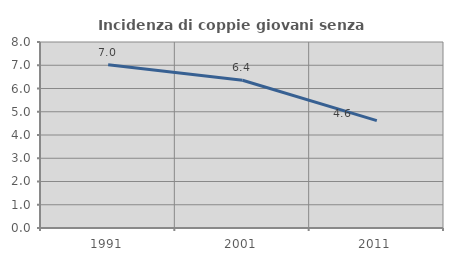
| Category | Incidenza di coppie giovani senza figli |
|---|---|
| 1991.0 | 7.025 |
| 2001.0 | 6.353 |
| 2011.0 | 4.619 |